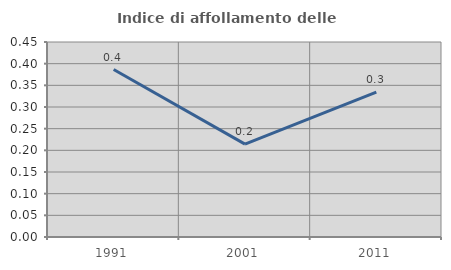
| Category | Indice di affollamento delle abitazioni  |
|---|---|
| 1991.0 | 0.387 |
| 2001.0 | 0.214 |
| 2011.0 | 0.334 |